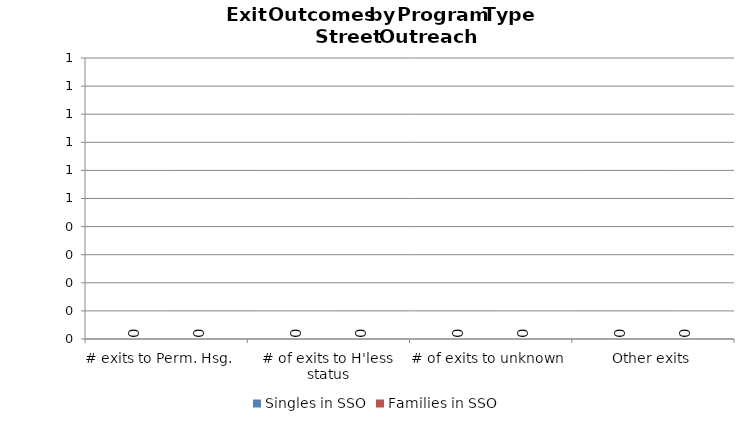
| Category | Singles in SSO | Families in SSO |
|---|---|---|
| # exits to Perm. Hsg.   | 0 | 0 |
| # of exits to H'less status | 0 | 0 |
| # of exits to unknown | 0 | 0 |
| Other exits | 0 | 0 |